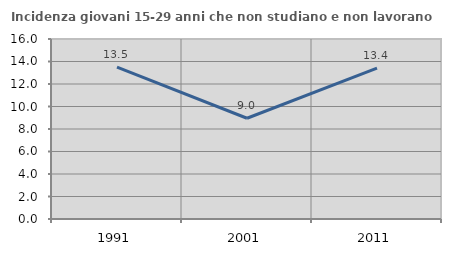
| Category | Incidenza giovani 15-29 anni che non studiano e non lavorano  |
|---|---|
| 1991.0 | 13.491 |
| 2001.0 | 8.954 |
| 2011.0 | 13.411 |